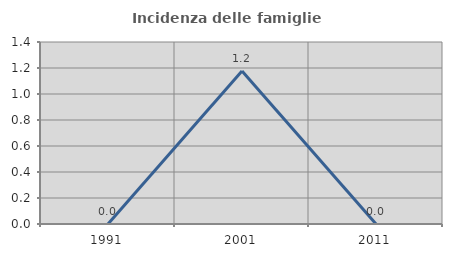
| Category | Incidenza delle famiglie numerose |
|---|---|
| 1991.0 | 0 |
| 2001.0 | 1.176 |
| 2011.0 | 0 |